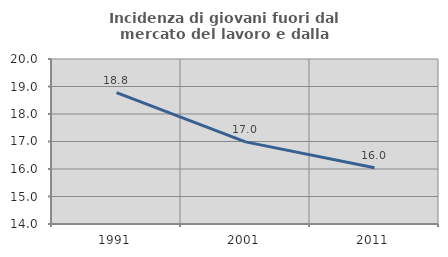
| Category | Incidenza di giovani fuori dal mercato del lavoro e dalla formazione  |
|---|---|
| 1991.0 | 18.775 |
| 2001.0 | 16.986 |
| 2011.0 | 16.045 |